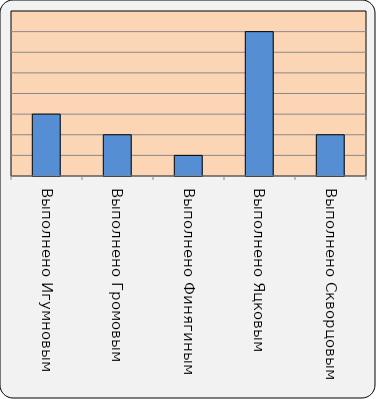
| Category | Series 0 |
|---|---|
| Выполнено Игумновым | 3 |
| Выполнено Громовым | 2 |
| Выполнено Финягиным | 1 |
| Выполнено Яцковым | 7 |
| Выполнено Скворцовым | 2 |